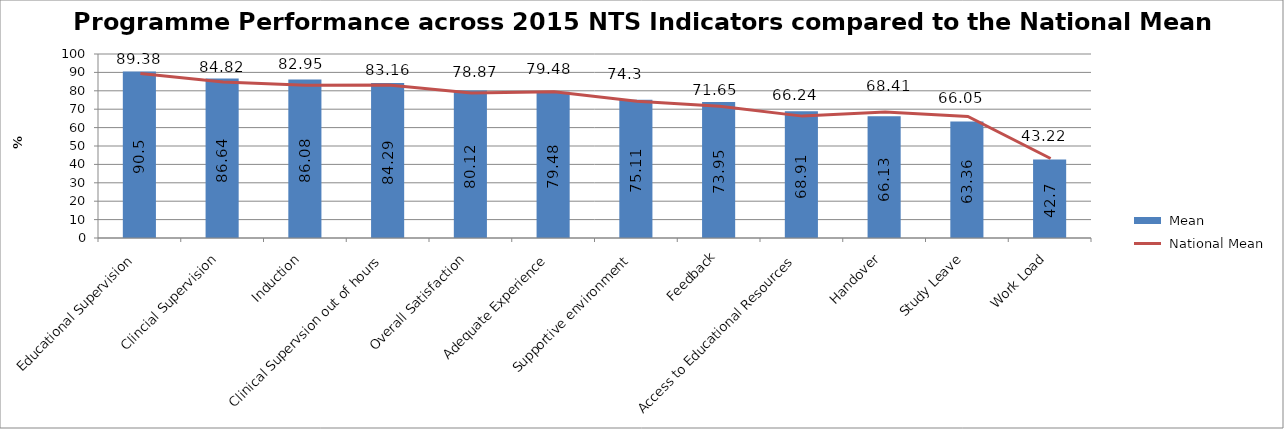
| Category |  Mean |
|---|---|
| Educational Supervision | 90.5 |
| Clincial Supervision  | 86.64 |
| Induction | 86.08 |
| Clinical Supervsion out of hours | 84.29 |
| Overall Satisfaction | 80.12 |
| Adequate Experience | 79.48 |
| Supportive environment | 75.11 |
| Feedback | 73.95 |
| Access to Educational Resources | 68.91 |
| Handover | 66.13 |
| Study Leave | 63.36 |
| Work Load | 42.7 |